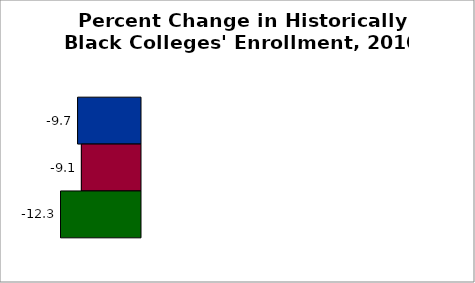
| Category | 50 states and D.C. | SREB states | State |
|---|---|---|---|
| 2011 to 2016 | -9.68 | -9.097 | -12.307 |